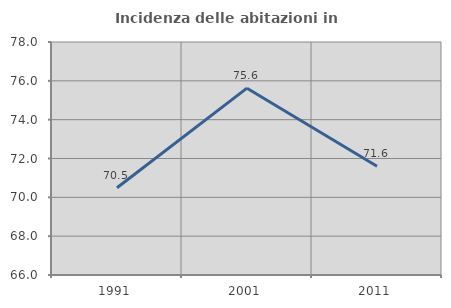
| Category | Incidenza delle abitazioni in proprietà  |
|---|---|
| 1991.0 | 70.495 |
| 2001.0 | 75.623 |
| 2011.0 | 71.597 |